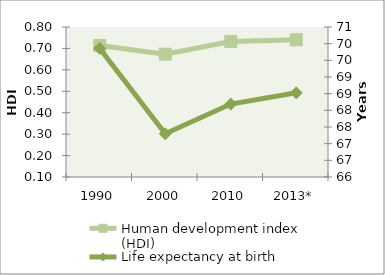
| Category | Human development index (HDI) |
|---|---|
| 1990 | 0.714 |
| 2000 | 0.673 |
| 2010 | 0.733 |
| 2013* | 0.74 |